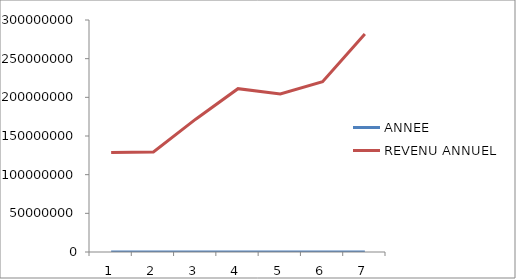
| Category | ANNEE | REVENU ANNUEL |
|---|---|---|
| 0 | 2005 | 128512000 |
| 1 | 2006 | 129435000 |
| 2 | 2007 | 171775135 |
| 3 | 2008 | 211216770 |
| 4 | 2009 | 204355626 |
| 5 | 2010 | 220085082 |
| 6 | 2011 | 281805744 |